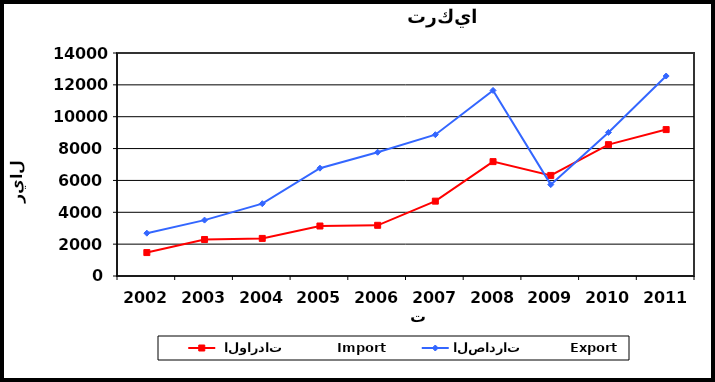
| Category |  الواردات           Import | الصادرات          Export |
|---|---|---|
| 2002.0 | 1471 | 2689 |
| 2003.0 | 2292 | 3509 |
| 2004.0 | 2360 | 4539 |
| 2005.0 | 3139 | 6769 |
| 2006.0 | 3183 | 7771 |
| 2007.0 | 4699 | 8872 |
| 2008.0 | 7181 | 11650 |
| 2009.0 | 6314 | 5737 |
| 2010.0 | 8246 | 9012 |
| 2011.0 | 9192 | 12555 |